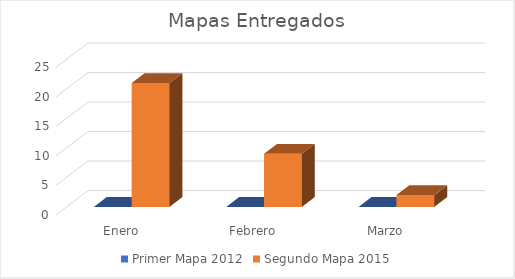
| Category | Primer Mapa 2012 | Segundo Mapa 2015 |
|---|---|---|
| Enero | 0 | 21 |
| Febrero | 0 | 9 |
| Marzo | 0 | 2 |